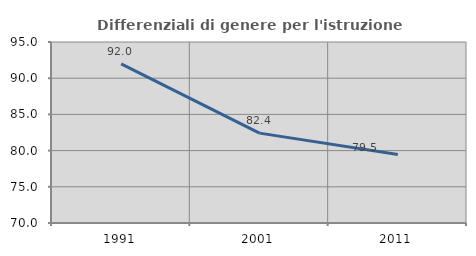
| Category | Differenziali di genere per l'istruzione superiore |
|---|---|
| 1991.0 | 91.973 |
| 2001.0 | 82.415 |
| 2011.0 | 79.464 |